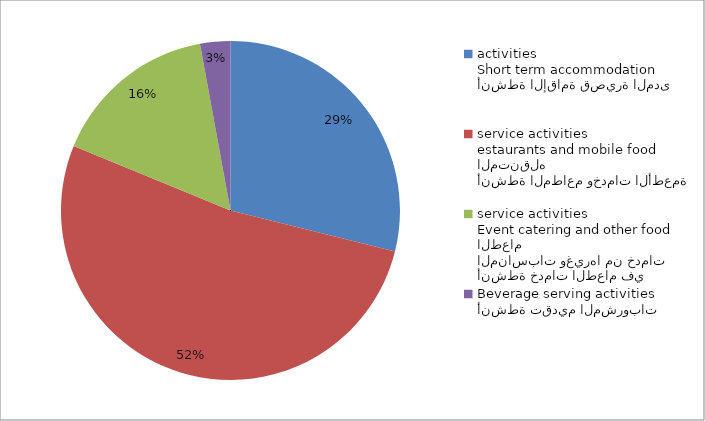
| Category | Series 0 |
|---|---|
| أنشطة الإقامة قصيرة المدى
Short term accommodation activities | 22142 |
| أنشطة المطاعم وخدمات الأطعمة المتنقله
estaurants and mobile food service activities | 40097 |
| أنشطة خدمات الطعام في المناسبات وغيرها من خدمات الطعام
Event catering and other food service activities | 12196 |
| أنشطة تقديم المشروبات
Beverage serving activities | 2212 |